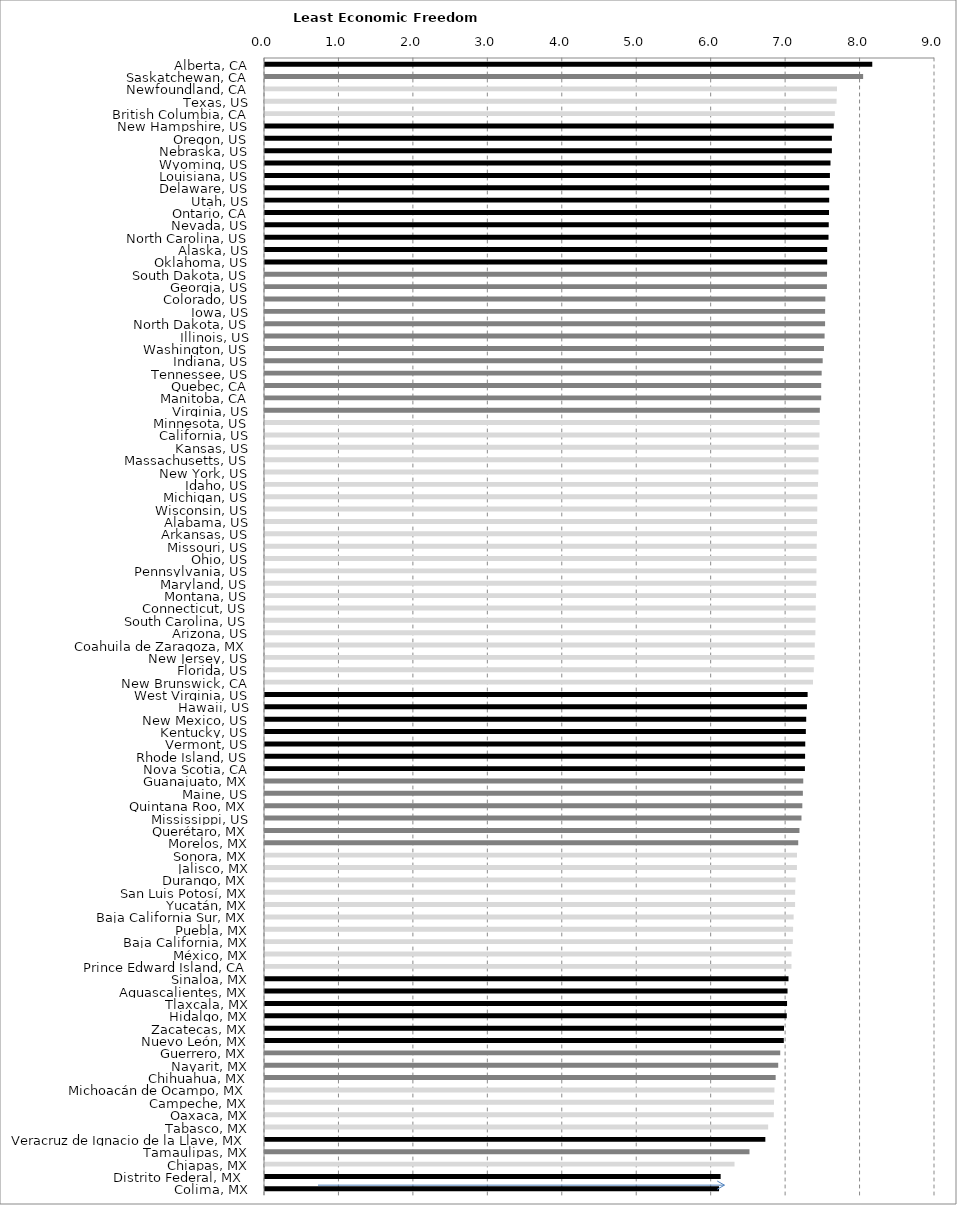
| Category | Series 0 |
|---|---|
| Alberta, CA | 8.157 |
| Saskatchewan, CA | 8.035 |
| Newfoundland, CA | 7.684 |
| Texas, US | 7.678 |
| British Columbia, CA | 7.655 |
| New Hampshire, US | 7.64 |
| Oregon, US | 7.615 |
| Nebraska, US | 7.615 |
| Wyoming, US | 7.596 |
| Louisiana, US | 7.588 |
| Delaware, US | 7.579 |
| Utah, US | 7.579 |
| Ontario, CA | 7.576 |
| Nevada, US | 7.573 |
| North Carolina, US | 7.57 |
| Alaska, US | 7.551 |
| Oklahoma, US | 7.551 |
| South Dakota, US | 7.55 |
| Georgia, US | 7.548 |
| Colorado, US | 7.527 |
| Iowa, US | 7.524 |
| North Dakota, US | 7.523 |
| Illinois, US | 7.517 |
| Washington, US | 7.509 |
| Indiana, US | 7.491 |
| Tennessee, US | 7.478 |
| Quebec, CA | 7.471 |
| Manitoba, CA | 7.471 |
| Virginia, US | 7.453 |
| Minnesota, US | 7.45 |
| California, US | 7.449 |
| Kansas, US | 7.439 |
| Massachusetts, US | 7.436 |
| New York, US | 7.434 |
| Idaho, US | 7.429 |
| Michigan, US | 7.419 |
| Wisconsin, US | 7.419 |
| Alabama, US | 7.417 |
| Arkansas, US | 7.414 |
| Missouri, US | 7.411 |
| Ohio, US | 7.41 |
| Pennsylvania, US | 7.407 |
| Maryland, US | 7.407 |
| Montana, US | 7.402 |
| Connecticut, US | 7.398 |
| South Carolina, US | 7.395 |
| Arizona, US | 7.393 |
| Coahuila de Zaragoza, MX | 7.385 |
| New Jersey, US | 7.382 |
| Florida, US | 7.372 |
| New Brunswick, CA | 7.361 |
| West Virginia, US | 7.289 |
| Hawaii, US | 7.28 |
| New Mexico, US | 7.27 |
| Kentucky, US | 7.265 |
| Vermont, US | 7.257 |
| Rhode Island, US | 7.255 |
| Nova Scotia, CA | 7.253 |
| Guanajuato, MX | 7.23 |
| Maine, US | 7.225 |
| Quintana Roo, MX | 7.218 |
| Mississippi, US | 7.206 |
| Querétaro, MX | 7.18 |
| Morelos, MX | 7.163 |
| Sonora, MX | 7.146 |
| Jalisco, MX | 7.145 |
| Durango, MX | 7.127 |
| San Luis Potosí, MX | 7.121 |
| Yucatán, MX | 7.12 |
| Baja California Sur, MX | 7.101 |
| Puebla, MX | 7.094 |
| Baja California, MX | 7.09 |
| México, MX | 7.073 |
| Prince Edward Island, CA | 7.072 |
| Sinaloa, MX | 7.032 |
| Aguascalientes, MX | 7.019 |
| Tlaxcala, MX | 7.013 |
| Hidalgo, MX | 7.009 |
| Zacatecas, MX | 6.972 |
| Nuevo León, MX | 6.969 |
| Guerrero, MX | 6.921 |
| Nayarit, MX | 6.894 |
| Chihuahua, MX | 6.86 |
| Michoacán de Ocampo, MX | 6.843 |
| Campeche, MX | 6.837 |
| Oaxaca, MX | 6.835 |
| Tabasco, MX | 6.759 |
| Veracruz de Ignacio de la Llave, MX | 6.721 |
| Tamaulipas, MX | 6.508 |
| Chiapas, MX | 6.307 |
| Distrito Federal, MX  | 6.121 |
| Colima, MX | 6.099 |